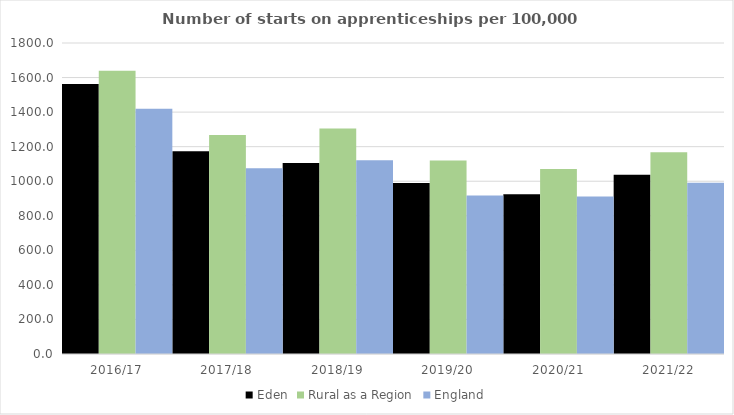
| Category | Eden | Rural as a Region | England |
|---|---|---|---|
| 2016/17 | 1563 | 1638.789 | 1420 |
| 2017/18 | 1174 | 1267.474 | 1075 |
| 2018/19 | 1105 | 1304.57 | 1122 |
| 2019/20 | 989 | 1119.662 | 918 |
| 2020/21 | 925 | 1070.748 | 912 |
| 2021/22 | 1037 | 1167.68 | 991 |